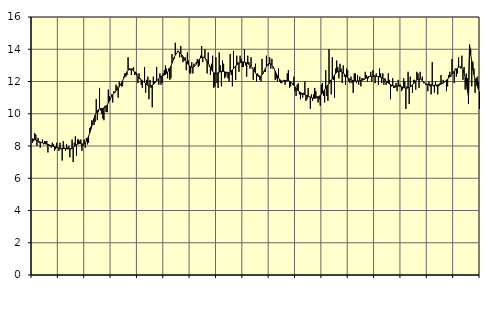
| Category | Piggar | Series 1 |
|---|---|---|
| nan | 8.2 | 8.45 |
| 87.0 | 8.3 | 8.42 |
| 87.0 | 8.8 | 8.39 |
| 87.0 | 8.7 | 8.37 |
| 87.0 | 8 | 8.34 |
| 87.0 | 8.5 | 8.3 |
| 87.0 | 8.2 | 8.27 |
| 87.0 | 7.9 | 8.25 |
| 87.0 | 8.2 | 8.22 |
| 87.0 | 8.4 | 8.19 |
| 87.0 | 8.1 | 8.17 |
| 87.0 | 8.3 | 8.15 |
| nan | 8.3 | 8.13 |
| 88.0 | 8.3 | 8.11 |
| 88.0 | 7.6 | 8.09 |
| 88.0 | 8 | 8.07 |
| 88.0 | 8 | 8.04 |
| 88.0 | 7.9 | 8.02 |
| 88.0 | 8.2 | 8 |
| 88.0 | 8.1 | 7.98 |
| 88.0 | 7.7 | 7.96 |
| 88.0 | 7.8 | 7.94 |
| 88.0 | 8.2 | 7.92 |
| 88.0 | 7.9 | 7.9 |
| nan | 7.7 | 7.88 |
| 89.0 | 8.2 | 7.86 |
| 89.0 | 7.8 | 7.85 |
| 89.0 | 7.1 | 7.85 |
| 89.0 | 8.3 | 7.84 |
| 89.0 | 7.9 | 7.84 |
| 89.0 | 7.7 | 7.84 |
| 89.0 | 8.1 | 7.83 |
| 89.0 | 7.9 | 7.82 |
| 89.0 | 8 | 7.81 |
| 89.0 | 7.3 | 7.82 |
| 89.0 | 7.8 | 7.83 |
| nan | 8.4 | 7.86 |
| 90.0 | 7 | 7.9 |
| 90.0 | 8.2 | 7.96 |
| 90.0 | 8.6 | 8.01 |
| 90.0 | 7.4 | 8.07 |
| 90.0 | 8.4 | 8.11 |
| 90.0 | 8.4 | 8.14 |
| 90.0 | 8.3 | 8.15 |
| 90.0 | 8.4 | 8.14 |
| 90.0 | 7.7 | 8.12 |
| 90.0 | 8 | 8.13 |
| 90.0 | 8.4 | 8.15 |
| nan | 7.9 | 8.21 |
| 91.0 | 8.5 | 8.31 |
| 91.0 | 8.1 | 8.44 |
| 91.0 | 8.2 | 8.61 |
| 91.0 | 9.1 | 8.8 |
| 91.0 | 9.2 | 9.02 |
| 91.0 | 9.6 | 9.25 |
| 91.0 | 9.5 | 9.49 |
| 91.0 | 9.3 | 9.71 |
| 91.0 | 9.5 | 9.91 |
| 91.0 | 10.9 | 10.07 |
| 91.0 | 9.6 | 10.19 |
| nan | 10.1 | 10.26 |
| 92.0 | 11.6 | 10.3 |
| 92.0 | 10.2 | 10.31 |
| 92.0 | 10 | 10.32 |
| 92.0 | 9.7 | 10.34 |
| 92.0 | 9.6 | 10.36 |
| 92.0 | 10.5 | 10.4 |
| 92.0 | 10.1 | 10.46 |
| 92.0 | 10.1 | 10.55 |
| 92.0 | 11.5 | 10.67 |
| 92.0 | 11.1 | 10.8 |
| 92.0 | 10.9 | 10.94 |
| nan | 11.2 | 11.07 |
| 93.0 | 10.7 | 11.18 |
| 93.0 | 11.4 | 11.27 |
| 93.0 | 11.3 | 11.35 |
| 93.0 | 11.8 | 11.42 |
| 93.0 | 11.7 | 11.49 |
| 93.0 | 11 | 11.57 |
| 93.0 | 12 | 11.67 |
| 93.0 | 11.8 | 11.79 |
| 93.0 | 11.7 | 11.92 |
| 93.0 | 11.7 | 12.06 |
| 93.0 | 12.3 | 12.2 |
| nan | 12.5 | 12.35 |
| 94.0 | 12.3 | 12.49 |
| 94.0 | 12.4 | 12.61 |
| 94.0 | 13.5 | 12.7 |
| 94.0 | 12.8 | 12.76 |
| 94.0 | 12.7 | 12.78 |
| 94.0 | 12.4 | 12.78 |
| 94.0 | 12.8 | 12.73 |
| 94.0 | 12.9 | 12.66 |
| 94.0 | 12.4 | 12.57 |
| 94.0 | 12.6 | 12.48 |
| 94.0 | 12.5 | 12.38 |
| nan | 11.9 | 12.29 |
| 95.0 | 12.5 | 12.21 |
| 95.0 | 12.2 | 12.15 |
| 95.0 | 11.8 | 12.1 |
| 95.0 | 11.6 | 12.05 |
| 95.0 | 12 | 11.99 |
| 95.0 | 12.9 | 11.94 |
| 95.0 | 11.3 | 11.88 |
| 95.0 | 12.1 | 11.81 |
| 95.0 | 12.3 | 11.76 |
| 95.0 | 10.9 | 11.73 |
| 95.0 | 12.1 | 11.71 |
| nan | 11.6 | 11.73 |
| 96.0 | 10.4 | 11.77 |
| 96.0 | 12.3 | 11.82 |
| 96.0 | 12 | 11.88 |
| 96.0 | 12 | 11.96 |
| 96.0 | 12.9 | 12.04 |
| 96.0 | 12.1 | 12.11 |
| 96.0 | 11.8 | 12.19 |
| 96.0 | 12.5 | 12.25 |
| 96.0 | 11.8 | 12.31 |
| 96.0 | 11.9 | 12.35 |
| 96.0 | 12.5 | 12.38 |
| nan | 12.7 | 12.41 |
| 97.0 | 13 | 12.44 |
| 97.0 | 12.8 | 12.5 |
| 97.0 | 12.2 | 12.58 |
| 97.0 | 12.8 | 12.68 |
| 97.0 | 12.1 | 12.81 |
| 97.0 | 12.2 | 12.96 |
| 97.0 | 13.7 | 13.13 |
| 97.0 | 13.3 | 13.31 |
| 97.0 | 13.4 | 13.49 |
| 97.0 | 14.4 | 13.64 |
| 97.0 | 13.7 | 13.76 |
| nan | 13.9 | 13.82 |
| 98.0 | 13.9 | 13.84 |
| 98.0 | 13.5 | 13.8 |
| 98.0 | 14.2 | 13.73 |
| 98.0 | 13.5 | 13.64 |
| 98.0 | 13.2 | 13.54 |
| 98.0 | 13.3 | 13.43 |
| 98.0 | 13.5 | 13.32 |
| 98.0 | 12.7 | 13.22 |
| 98.0 | 13.8 | 13.12 |
| 98.0 | 13.3 | 13.04 |
| 98.0 | 12.5 | 12.97 |
| nan | 12.5 | 12.92 |
| 99.0 | 13.2 | 12.89 |
| 99.0 | 12.5 | 12.89 |
| 99.0 | 13.1 | 12.92 |
| 99.0 | 13 | 12.98 |
| 99.0 | 13.2 | 13.07 |
| 99.0 | 13.4 | 13.18 |
| 99.0 | 12.9 | 13.29 |
| 99.0 | 13 | 13.39 |
| 99.0 | 13.6 | 13.46 |
| 99.0 | 14.2 | 13.5 |
| 99.0 | 13.2 | 13.52 |
| nan | 13.5 | 13.5 |
| 0.0 | 14 | 13.46 |
| 0.0 | 13.3 | 13.38 |
| 0.0 | 12.5 | 13.28 |
| 0.0 | 13.8 | 13.15 |
| 0.0 | 12.9 | 13.01 |
| 0.0 | 12.4 | 12.87 |
| 0.0 | 13.1 | 12.73 |
| 0.0 | 13.6 | 12.63 |
| 0.0 | 11.6 | 12.55 |
| 0.0 | 11.7 | 12.51 |
| 0.0 | 13.5 | 12.5 |
| nan | 11.9 | 12.51 |
| 1.0 | 11.6 | 12.54 |
| 1.0 | 13.8 | 12.57 |
| 1.0 | 13 | 12.61 |
| 1.0 | 11.7 | 12.63 |
| 1.0 | 13.3 | 12.63 |
| 1.0 | 13.1 | 12.62 |
| 1.0 | 12.2 | 12.6 |
| 1.0 | 12.3 | 12.57 |
| 1.0 | 12.6 | 12.54 |
| 1.0 | 12.2 | 12.54 |
| 1.0 | 12 | 12.55 |
| nan | 13.7 | 12.59 |
| 2.0 | 12.4 | 12.65 |
| 2.0 | 11.7 | 12.73 |
| 2.0 | 13.9 | 12.8 |
| 2.0 | 12.9 | 12.88 |
| 2.0 | 12.1 | 12.96 |
| 2.0 | 13.6 | 13.03 |
| 2.0 | 13.2 | 13.08 |
| 2.0 | 12.6 | 13.13 |
| 2.0 | 13.6 | 13.16 |
| 2.0 | 13.4 | 13.19 |
| 2.0 | 12.9 | 13.21 |
| nan | 12.9 | 13.21 |
| 3.0 | 14 | 13.2 |
| 3.0 | 13 | 13.18 |
| 3.0 | 12.3 | 13.15 |
| 3.0 | 13.6 | 13.11 |
| 3.0 | 13.2 | 13.06 |
| 3.0 | 12.8 | 13.01 |
| 3.0 | 13.5 | 12.94 |
| 3.0 | 12.8 | 12.86 |
| 3.0 | 12.1 | 12.76 |
| 3.0 | 12.9 | 12.66 |
| 3.0 | 13.1 | 12.55 |
| nan | 12 | 12.44 |
| 4.0 | 12.5 | 12.36 |
| 4.0 | 12.4 | 12.31 |
| 4.0 | 12.1 | 12.3 |
| 4.0 | 12 | 12.34 |
| 4.0 | 13.4 | 12.42 |
| 4.0 | 12.5 | 12.52 |
| 4.0 | 12.6 | 12.66 |
| 4.0 | 12.6 | 12.8 |
| 4.0 | 13.6 | 12.93 |
| 4.0 | 13 | 13.04 |
| 4.0 | 13 | 13.11 |
| nan | 13.5 | 13.13 |
| 5.0 | 12.8 | 13.1 |
| 5.0 | 13.4 | 13.03 |
| 5.0 | 12.8 | 12.92 |
| 5.0 | 12.8 | 12.79 |
| 5.0 | 12.1 | 12.64 |
| 5.0 | 12.2 | 12.49 |
| 5.0 | 12 | 12.35 |
| 5.0 | 12.8 | 12.23 |
| 5.0 | 12 | 12.13 |
| 5.0 | 11.9 | 12.07 |
| 5.0 | 11.9 | 12.03 |
| nan | 12 | 12.02 |
| 6.0 | 12.1 | 12.03 |
| 6.0 | 11.8 | 12.05 |
| 6.0 | 12 | 12.06 |
| 6.0 | 12.5 | 12.06 |
| 6.0 | 12.7 | 12.05 |
| 6.0 | 11.6 | 12.02 |
| 6.0 | 11.7 | 11.98 |
| 6.0 | 11.9 | 11.92 |
| 6.0 | 11.8 | 11.85 |
| 6.0 | 12.3 | 11.76 |
| 6.0 | 11.4 | 11.66 |
| nan | 11.1 | 11.57 |
| 7.0 | 11.8 | 11.49 |
| 7.0 | 11.9 | 11.42 |
| 7.0 | 11.2 | 11.37 |
| 7.0 | 10.9 | 11.32 |
| 7.0 | 11.2 | 11.28 |
| 7.0 | 11 | 11.25 |
| 7.0 | 11.3 | 11.21 |
| 7.0 | 12 | 11.18 |
| 7.0 | 10.8 | 11.15 |
| 7.0 | 10.9 | 11.12 |
| 7.0 | 11.6 | 11.09 |
| nan | 11.1 | 11.06 |
| 8.0 | 10.3 | 11.03 |
| 8.0 | 11.2 | 11 |
| 8.0 | 10.8 | 10.98 |
| 8.0 | 11.2 | 10.96 |
| 8.0 | 11.6 | 10.96 |
| 8.0 | 11.4 | 10.98 |
| 8.0 | 11.1 | 11 |
| 8.0 | 10.7 | 11.03 |
| 8.0 | 10.9 | 11.08 |
| 8.0 | 10.5 | 11.14 |
| 8.0 | 11.8 | 11.2 |
| nan | 11.9 | 11.28 |
| 9.0 | 11.1 | 11.38 |
| 9.0 | 10.7 | 11.49 |
| 9.0 | 12.7 | 11.59 |
| 9.0 | 11.1 | 11.69 |
| 9.0 | 10.8 | 11.78 |
| 9.0 | 14 | 11.87 |
| 9.0 | 12.1 | 11.97 |
| 9.0 | 11.2 | 12.07 |
| 9.0 | 13.5 | 12.18 |
| 9.0 | 12.1 | 12.29 |
| 9.0 | 11 | 12.4 |
| nan | 12.8 | 12.49 |
| 10.0 | 13.3 | 12.57 |
| 10.0 | 12.9 | 12.62 |
| 10.0 | 12.2 | 12.64 |
| 10.0 | 13.1 | 12.64 |
| 10.0 | 12.8 | 12.62 |
| 10.0 | 11.9 | 12.59 |
| 10.0 | 13 | 12.53 |
| 10.0 | 12.3 | 12.46 |
| 10.0 | 11.8 | 12.38 |
| 10.0 | 12.8 | 12.3 |
| 10.0 | 12.7 | 12.23 |
| nan | 12 | 12.18 |
| 11.0 | 11.9 | 12.14 |
| 11.0 | 12.3 | 12.11 |
| 11.0 | 11.9 | 12.08 |
| 11.0 | 11.3 | 12.06 |
| 11.0 | 12.5 | 12.05 |
| 11.0 | 12.5 | 12.03 |
| 11.0 | 11.9 | 12.03 |
| 11.0 | 12.4 | 12.03 |
| 11.0 | 11.8 | 12.04 |
| 11.0 | 12.3 | 12.05 |
| 11.0 | 11.7 | 12.06 |
| nan | 12.2 | 12.07 |
| 12.0 | 12.2 | 12.1 |
| 12.0 | 12.1 | 12.14 |
| 12.0 | 12.6 | 12.18 |
| 12.0 | 12.4 | 12.22 |
| 12.0 | 12 | 12.27 |
| 12.0 | 12.2 | 12.3 |
| 12.0 | 12.3 | 12.32 |
| 12.0 | 12.6 | 12.32 |
| 12.0 | 12 | 12.33 |
| 12.0 | 12.7 | 12.33 |
| 12.0 | 12.4 | 12.33 |
| nan | 11.9 | 12.33 |
| 13.0 | 12.5 | 12.33 |
| 13.0 | 12.3 | 12.32 |
| 13.0 | 11.8 | 12.3 |
| 13.0 | 12.8 | 12.28 |
| 13.0 | 12.5 | 12.26 |
| 13.0 | 11.9 | 12.23 |
| 13.0 | 12.5 | 12.19 |
| 13.0 | 11.8 | 12.14 |
| 13.0 | 12.2 | 12.09 |
| 13.0 | 11.8 | 12.03 |
| 13.0 | 12 | 11.97 |
| nan | 12.5 | 11.9 |
| 14.0 | 12.1 | 11.85 |
| 14.0 | 10.9 | 11.81 |
| 14.0 | 11.7 | 11.77 |
| 14.0 | 12.2 | 11.74 |
| 14.0 | 11.6 | 11.72 |
| 14.0 | 11.6 | 11.72 |
| 14.0 | 11.9 | 11.72 |
| 14.0 | 11.4 | 11.72 |
| 14.0 | 12.1 | 11.72 |
| 14.0 | 11.8 | 11.71 |
| 14.0 | 11.8 | 11.7 |
| nan | 11.4 | 11.67 |
| 15.0 | 11.5 | 11.65 |
| 15.0 | 12.2 | 11.62 |
| 15.0 | 12 | 11.61 |
| 15.0 | 10.3 | 11.59 |
| 15.0 | 11.7 | 11.59 |
| 15.0 | 12.6 | 11.6 |
| 15.0 | 10.6 | 11.63 |
| 15.0 | 12.3 | 11.67 |
| 15.0 | 11.7 | 11.73 |
| 15.0 | 11.3 | 11.8 |
| 15.0 | 12.1 | 11.87 |
| nan | 12.1 | 11.96 |
| 16.0 | 11.5 | 12.03 |
| 16.0 | 12.6 | 12.1 |
| 16.0 | 12.5 | 12.14 |
| 16.0 | 11.6 | 12.16 |
| 16.0 | 12.6 | 12.16 |
| 16.0 | 12.1 | 12.12 |
| 16.0 | 12.3 | 12.06 |
| 16.0 | 11.9 | 12 |
| 16.0 | 11.9 | 11.93 |
| 16.0 | 11.8 | 11.88 |
| 16.0 | 11.8 | 11.84 |
| nan | 11.4 | 11.82 |
| 17.0 | 12 | 11.81 |
| 17.0 | 11.7 | 11.8 |
| 17.0 | 11.2 | 11.79 |
| 17.0 | 13.2 | 11.78 |
| 17.0 | 11.7 | 11.77 |
| 17.0 | 11.3 | 11.77 |
| 17.0 | 12 | 11.77 |
| 17.0 | 11.7 | 11.78 |
| 17.0 | 11.2 | 11.79 |
| 17.0 | 11.7 | 11.8 |
| 17.0 | 11.9 | 11.82 |
| nan | 12.4 | 11.84 |
| 18.0 | 11.9 | 11.86 |
| 18.0 | 12.1 | 11.9 |
| 18.0 | 12 | 11.96 |
| 18.0 | 12 | 12.02 |
| 18.0 | 11.4 | 12.08 |
| 18.0 | 11.7 | 12.15 |
| 18.0 | 12.4 | 12.23 |
| 18.0 | 12.6 | 12.3 |
| 18.0 | 12.3 | 12.38 |
| 18.0 | 13.4 | 12.46 |
| 18.0 | 12.5 | 12.55 |
| nan | 11.9 | 12.64 |
| 19.0 | 12.8 | 12.71 |
| 19.0 | 12.3 | 12.78 |
| 19.0 | 12.5 | 12.83 |
| 19.0 | 13.5 | 12.88 |
| 19.0 | 12.9 | 12.91 |
| 19.0 | 12.8 | 12.91 |
| 19.0 | 13.6 | 12.85 |
| 19.0 | 12.1 | 12.73 |
| 19.0 | 12.9 | 12.53 |
| 19.0 | 11.5 | 12.24 |
| 19.0 | 12.5 | 11.88 |
| nan | 12.2 | 11.47 |
| 20.0 | 10.6 | 11.04 |
| 20.0 | 14.3 | 14.2 |
| 20.0 | 14 | 13.68 |
| 20.0 | 11.7 | 13.28 |
| 20.0 | 13.2 | 12.75 |
| 20.0 | 12.8 | 12.43 |
| 20.0 | 11.3 | 12.15 |
| 20.0 | 12.2 | 11.91 |
| 20.0 | 12.3 | 11.71 |
| 20.0 | 12 | 11.53 |
| 20.0 | 10.3 | 11.36 |